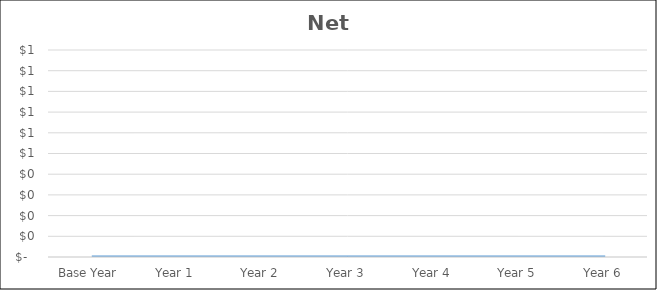
| Category | Net Income |
|---|---|
| Base Year | 0 |
| Year 1 | 0 |
| Year 2 | 0 |
| Year 3 | 0 |
| Year 4 | 0 |
| Year 5 | 0 |
| Year 6 | 0 |